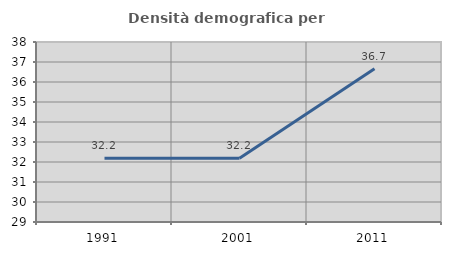
| Category | Densità demografica |
|---|---|
| 1991.0 | 32.186 |
| 2001.0 | 32.186 |
| 2011.0 | 36.659 |